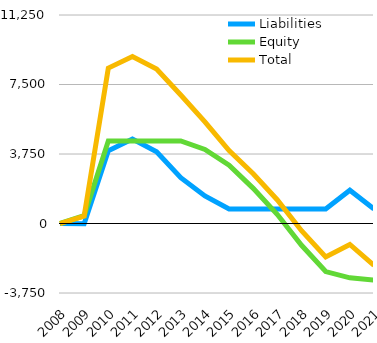
| Category | Liabilities  | Equity  | Total  |
|---|---|---|---|
| 2008 | -4.8 | 0 | -4.8 |
| 2009 | -17.45 | 420.4 | 402.95 |
| 2010 | 3928.55 | 4456.4 | 8384.95 |
| 2011 | 4554.55 | 4453.9 | 9008.45 |
| 2012 | 3875.55 | 4453.9 | 8329.45 |
| 2013 | 2475.55 | 4453.9 | 6929.45 |
| 2014 | 1487.55 | 3993.9 | 5481.45 |
| 2015 | 787.55 | 3142.9 | 3930.45 |
| 2016 | 787.55 | 1895.9 | 2683.45 |
| 2017 | 787.55 | 481.9 | 1269.45 |
| 2018 | 787.55 | -1177.1 | -389.55 |
| 2019 | 787.55 | -2593.1 | -1805.55 |
| 2020 | 1798.55 | -2930.1 | -1131.55 |
| 2021 | 787.55 | -3050.1 | -2262.55 |